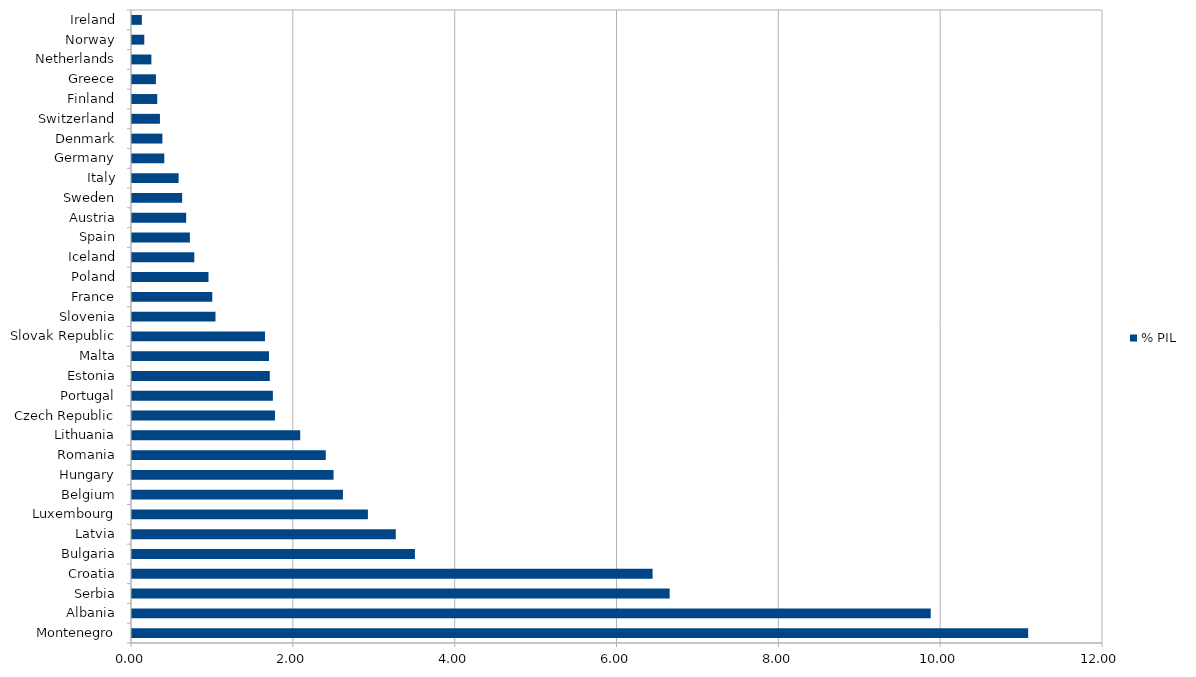
| Category | % PIL |
|---|---|
| Montenegro | 11.075 |
| Albania | 9.871 |
| Serbia | 6.645 |
| Croatia | 6.434 |
| Bulgaria | 3.496 |
| Latvia | 3.26 |
| Luxembourg | 2.916 |
| Belgium | 2.607 |
| Hungary | 2.491 |
| Romania | 2.395 |
| Lithuania | 2.079 |
| Czech Republic | 1.767 |
| Portugal | 1.741 |
| Estonia | 1.703 |
| Malta | 1.693 |
| Slovak Republic | 1.643 |
| Slovenia | 1.032 |
| France | 0.992 |
| Poland | 0.945 |
| Iceland | 0.77 |
| Spain | 0.716 |
| Austria | 0.669 |
| Sweden | 0.62 |
| Italy | 0.576 |
| Germany | 0.399 |
| Denmark | 0.376 |
| Switzerland | 0.345 |
| Finland | 0.312 |
| Greece | 0.296 |
| Netherlands | 0.24 |
| Norway | 0.152 |
| Ireland | 0.122 |